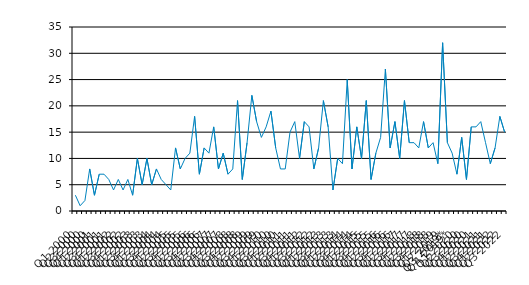
| Category | Series 0 |
|---|---|
| Q1 2000 | 3 |
| Q2 2000 | 1 |
| Q3 2000 | 2 |
| Q4 2000 | 8 |
| Q1 2001 | 3 |
| Q2 2001 | 7 |
| Q3 2001 | 7 |
| Q4 2001 | 6 |
| Q1 2002 | 4 |
| Q2 2002 | 6 |
| Q3 2002 | 4 |
| Q4 2002 | 6 |
| Q1 2003 | 3 |
| Q2 2003 | 10 |
| Q3 2003 | 5 |
| Q4 2003 | 10 |
| Q1 2004 | 5 |
| Q2 2004 | 8 |
| Q3 2004 | 6 |
| Q4 2004 | 5 |
| Q1 2005 | 4 |
| Q2 2005 | 12 |
| Q3 2005 | 8 |
| Q4 2005 | 10 |
| Q1 2006 | 11 |
| Q2 2006 | 18 |
| Q3 2006 | 7 |
| Q4 2006 | 12 |
| Q1 2007 | 11 |
| Q2 2007 | 16 |
| Q3 2007 | 8 |
| Q4 2007 | 11 |
| Q1 2008 | 7 |
| Q2 2008 | 8 |
| Q3 2008 | 21 |
| Q4 2008 | 6 |
| Q1 2009 | 13 |
| Q2 2009 | 22 |
| Q3 2009 | 17 |
| Q4 2009 | 14 |
| Q1 2010 | 16 |
| Q2 2010 | 19 |
| Q3 2010 | 12 |
| Q4 2010 | 8 |
| Q1 2011 | 8 |
| Q2 2011 | 15 |
| Q3 2011 | 17 |
| Q4 2011 | 10 |
| Q1 2012 | 17 |
| Q2 2012 | 16 |
| Q3 2012 | 8 |
| Q4 2012 | 12 |
| Q1 2013 | 21 |
| Q2 2013 | 16 |
| Q3 2013 | 4 |
| Q4 2013 | 10 |
| Q1 2014 | 9 |
| Q2 2014 | 25 |
| Q3 2014 | 8 |
| Q4 2014 | 16 |
| Q1 2015 | 10 |
| Q2 2015 | 21 |
| Q3 2015 | 6 |
| Q4 2015 | 11 |
| Q1 2016 | 14 |
| Q2 2016 | 27 |
| Q3 2016 | 12 |
| Q4 2016 | 17 |
| Q1 2017 | 10 |
| Q2 2017 | 21 |
| Q3 2017 | 13 |
| Q4 2017 | 13 |
| Q1 2018 | 12 |
| Q2 2018 | 17 |
| Q3 2018 | 12 |
| Q4 2018 | 13 |
| Q1 2019 | 9 |
| Q2 2019 | 32 |
| Q3 2019* | 13 |
| Q4 2019* | 11 |
| Q1 2020 | 7 |
| Q2 2020 | 14 |
| Q3 2020 | 6 |
| Q4 2020 | 16 |
| Q1 2021 | 16 |
| Q2 2021 | 17 |
| Q3 2021 | 13 |
| Q4 2021 | 9 |
| Q1 2022 | 12 |
| Q2 2022 | 18 |
| Q3 2022 | 15 |